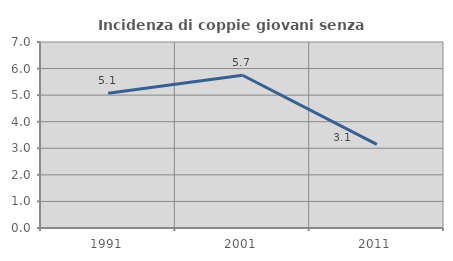
| Category | Incidenza di coppie giovani senza figli |
|---|---|
| 1991.0 | 5.07 |
| 2001.0 | 5.749 |
| 2011.0 | 3.149 |